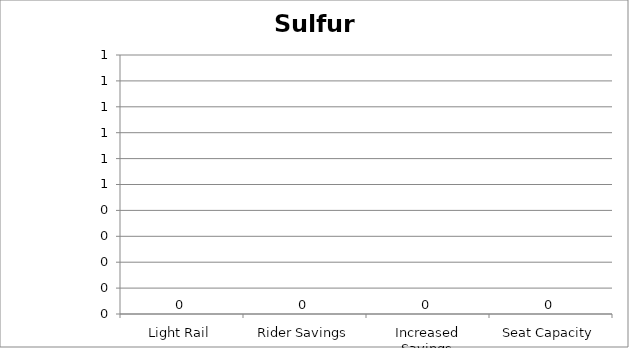
| Category | Sulfur Oxides |
|---|---|
| Light Rail | 0 |
| Rider Savings | 0 |
| Increased Savings | 0 |
| Seat Capacity | 0 |